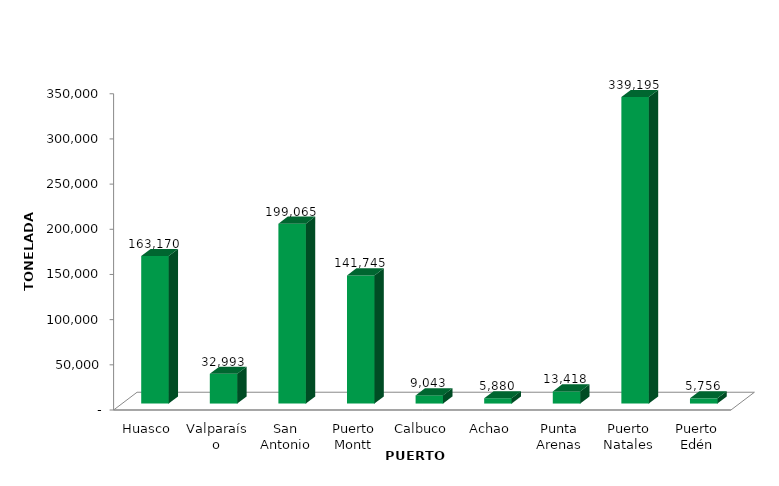
| Category | Series 0 |
|---|---|
| Huasco | 163170 |
| Valparaíso | 32993.2 |
| San Antonio | 199065 |
| Puerto Montt | 141745 |
| Calbuco | 9043 |
| Achao | 5880 |
| Punta Arenas | 13418 |
| Puerto Natales | 339195 |
| Puerto Edén | 5756 |